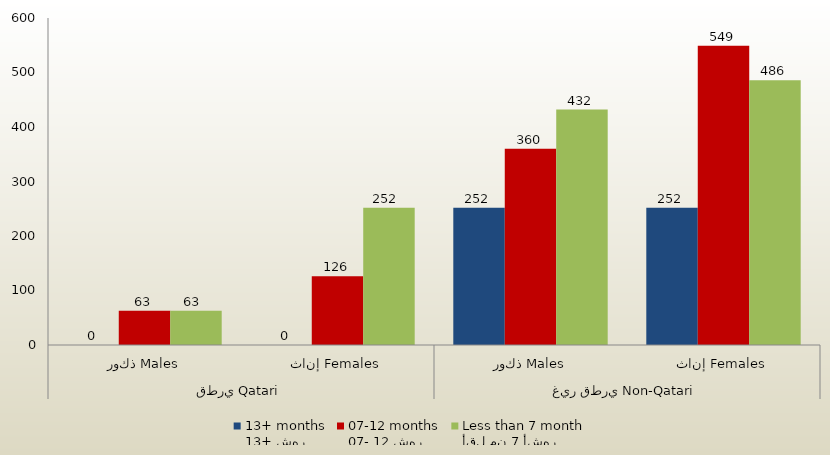
| Category | 13+ شهر
13+ months | 07- 12 شهر
07-12 months | أقل من 7 أشهر
Less than 7 month  |
|---|---|---|---|
| 0 | 0 | 63 | 63 |
| 1 | 0 | 126 | 252 |
| 2 | 252 | 360 | 432 |
| 3 | 252 | 549 | 486 |